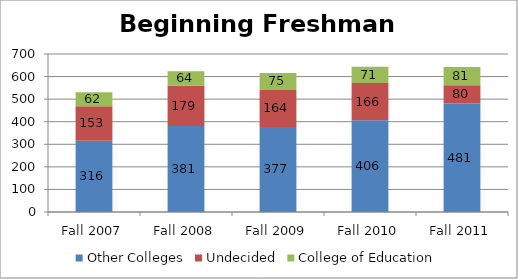
| Category | Other Colleges | Undecided | College of Education |
|---|---|---|---|
| Fall 2007 | 316 | 153 | 62 |
| Fall 2008 | 381 | 179 | 64 |
| Fall 2009 | 377 | 164 | 75 |
| Fall 2010 | 406 | 166 | 71 |
| Fall 2011 | 481 | 80 | 81 |